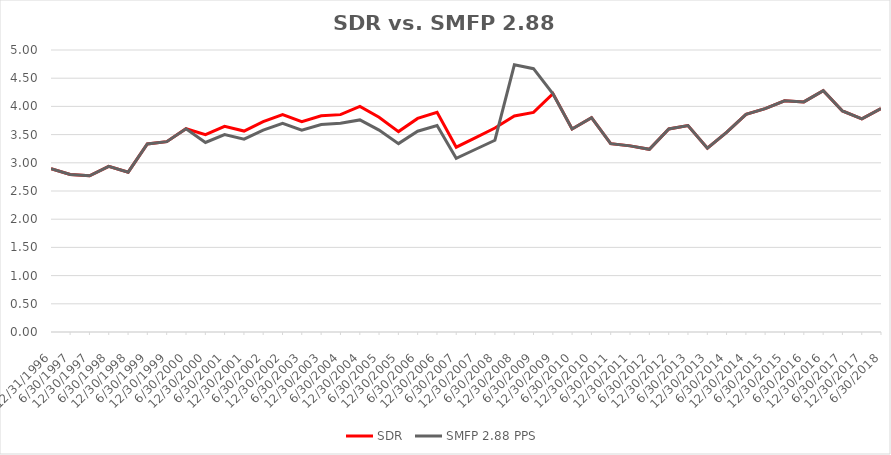
| Category | SDR | SMFP 2.88 PPS |
|---|---|---|
| 12/31/96 | 2.896 | 2.896 |
| 6/30/97 | 2.792 | 2.792 |
| 12/31/97 | 2.771 | 2.771 |
| 6/30/98 | 2.938 | 2.938 |
| 12/31/98 | 2.833 | 2.833 |
| 6/30/99 | 3.333 | 3.333 |
| 12/31/99 | 3.375 | 3.375 |
| 6/30/00 | 3.604 | 3.604 |
| 12/31/00 | 3.5 | 3.36 |
| 6/30/01 | 3.646 | 3.5 |
| 12/31/01 | 3.562 | 3.42 |
| 6/30/02 | 3.729 | 3.58 |
| 12/31/02 | 3.854 | 3.7 |
| 6/30/03 | 3.729 | 3.58 |
| 12/31/03 | 3.833 | 3.68 |
| 6/30/04 | 3.854 | 3.7 |
| 12/31/04 | 4 | 3.76 |
| 6/30/05 | 3.809 | 3.58 |
| 12/31/05 | 3.553 | 3.34 |
| 6/30/06 | 3.787 | 3.56 |
| 12/31/06 | 3.894 | 3.66 |
| 6/30/07 | 3.277 | 3.08 |
| 12/31/07 | 3.447 | 3.24 |
| 6/30/08 | 3.617 | 3.4 |
| 12/31/08 | 3.83 | 4.737 |
| 6/30/09 | 3.894 | 4.669 |
| 12/31/09 | 4.227 | 4.225 |
| 6/30/10 | 3.6 | 3.6 |
| 12/31/10 | 3.8 | 3.8 |
| 6/30/11 | 3.34 | 3.34 |
| 12/31/11 | 3.3 | 3.3 |
| 6/30/12 | 3.24 | 3.24 |
| 12/31/12 | 3.6 | 3.6 |
| 6/30/13 | 3.66 | 3.66 |
| 12/31/13 | 3.26 | 3.26 |
| 6/30/14 | 3.54 | 3.54 |
| 12/31/14 | 3.86 | 3.86 |
| 6/30/15 | 3.96 | 3.96 |
| 12/31/15 | 4.1 | 4.1 |
| 6/30/16 | 4.08 | 4.08 |
| 12/31/16 | 4.28 | 4.28 |
| 6/30/17 | 3.92 | 3.92 |
| 12/31/17 | 3.78 | 3.78 |
| 6/30/18 | 3.96 | 3.96 |